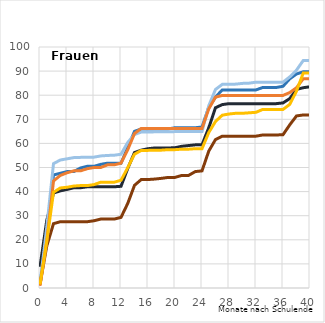
| Category | 1,00 Nichtmigranten - max einfacher Hauptschulabschluss | 2,00 Nichtmigranten - qualifizierender Hauptschulabschluss | 3,00 Nichtmigranten - mittlerer Schulabschluss | 4,00 Migranten - max einfacher Hauptschulabschluss | 5,00 Migranten - qualifizierender Hauptschulabschluss | 6,00 Migranten - mittlerer Schulabschluss |
|---|---|---|---|---|---|---|
| 0.0 | 8.8 | 1.8 | 1.9 | 1.5 | 0.9 | 1.5 |
| 1.0 | 28 | 21.7 | 25.2 | 17.4 | 19.3 | 19.4 |
| 2.0 | 39.4 | 46.9 | 51.6 | 26.7 | 44.4 | 39.7 |
| 3.0 | 40.3 | 47.6 | 53.1 | 27.5 | 46.7 | 41.5 |
| 4.0 | 40.9 | 48.3 | 53.6 | 27.5 | 47.8 | 41.8 |
| 5.0 | 41.6 | 48.3 | 54.1 | 27.5 | 48.6 | 42.3 |
| 6.0 | 41.6 | 49.8 | 54.2 | 27.5 | 48.6 | 42.5 |
| 7.0 | 42 | 50.5 | 54.3 | 27.5 | 49.5 | 42.5 |
| 8.0 | 42 | 50.5 | 54.3 | 27.9 | 50 | 42.9 |
| 9.0 | 42 | 51.3 | 54.8 | 28.6 | 50 | 43.9 |
| 10.0 | 42 | 51.8 | 55 | 28.6 | 51.1 | 43.9 |
| 11.0 | 42 | 51.8 | 55.1 | 28.6 | 51.1 | 43.9 |
| 12.0 | 42.2 | 51.8 | 55.5 | 29.3 | 51.8 | 44.7 |
| 13.0 | 49.6 | 58.3 | 60.4 | 35.1 | 57.4 | 49.9 |
| 14.0 | 56.2 | 65 | 63.7 | 42.6 | 64.1 | 55.5 |
| 15.0 | 57.2 | 66 | 64.7 | 45 | 66.2 | 57.1 |
| 16.0 | 57.8 | 66 | 64.7 | 45 | 66.2 | 57.1 |
| 17.0 | 58.1 | 66 | 64.8 | 45.2 | 66.2 | 57.2 |
| 18.0 | 58.1 | 66 | 64.8 | 45.5 | 66.2 | 57.2 |
| 19.0 | 58.1 | 66 | 64.8 | 45.9 | 66.2 | 57.4 |
| 20.0 | 58.2 | 66.5 | 64.9 | 45.9 | 66.2 | 57.4 |
| 21.0 | 58.8 | 66.5 | 64.9 | 46.7 | 66.2 | 57.6 |
| 22.0 | 59.1 | 66.5 | 64.9 | 46.7 | 66.2 | 57.6 |
| 23.0 | 59.4 | 66.5 | 64.9 | 48.3 | 66.2 | 57.8 |
| 24.0 | 59.4 | 66.8 | 64.9 | 48.6 | 66.2 | 57.8 |
| 25.0 | 66.5 | 75 | 75.6 | 56.8 | 74.3 | 64.5 |
| 26.0 | 74.8 | 79.2 | 82.4 | 61.6 | 79.2 | 69.1 |
| 27.0 | 76.1 | 82.2 | 84.5 | 63 | 79.9 | 71.7 |
| 28.0 | 76.5 | 82.2 | 84.5 | 63 | 79.9 | 72.2 |
| 29.0 | 76.5 | 82.2 | 84.6 | 63 | 79.9 | 72.5 |
| 30.0 | 76.5 | 82.2 | 84.9 | 63 | 79.9 | 72.5 |
| 31.0 | 76.5 | 82.2 | 85 | 63 | 79.9 | 72.7 |
| 32.0 | 76.5 | 82.2 | 85.4 | 63 | 79.9 | 72.9 |
| 33.0 | 76.5 | 83.2 | 85.4 | 63.5 | 79.9 | 74.1 |
| 34.0 | 76.5 | 83.2 | 85.4 | 63.5 | 79.9 | 74.1 |
| 35.0 | 76.5 | 83.2 | 85.4 | 63.5 | 79.9 | 74.1 |
| 36.0 | 76.8 | 83.7 | 85.4 | 63.6 | 79.9 | 74.1 |
| 37.0 | 78.6 | 86.8 | 87.6 | 67.7 | 81.1 | 76.2 |
| 38.0 | 82.4 | 88.8 | 90.4 | 71.4 | 83.1 | 81.7 |
| 39.0 | 83.1 | 89.7 | 94.4 | 71.8 | 86.8 | 89.2 |
| 40.0 | 83.5 | 89.7 | 94.4 | 71.8 | 86.8 | 89.2 |